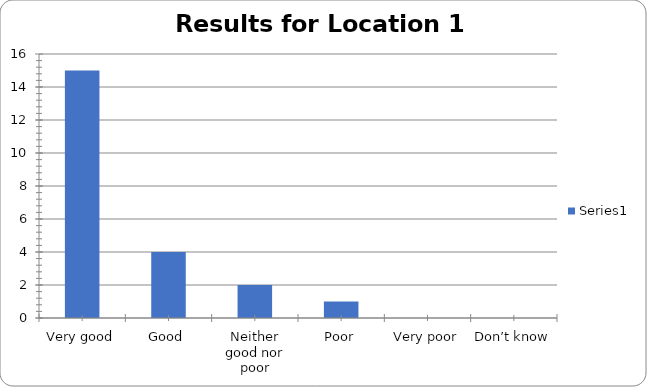
| Category | Series 0 |
|---|---|
| Very good | 15 |
| Good | 4 |
| Neither good nor poor | 2 |
| Poor | 1 |
| Very poor | 0 |
| Don’t know | 0 |